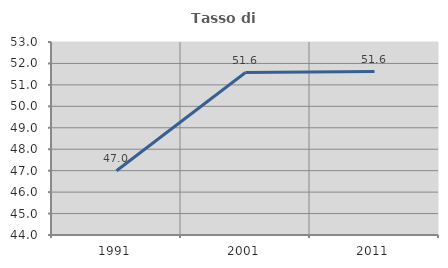
| Category | Tasso di occupazione   |
|---|---|
| 1991.0 | 46.998 |
| 2001.0 | 51.575 |
| 2011.0 | 51.619 |